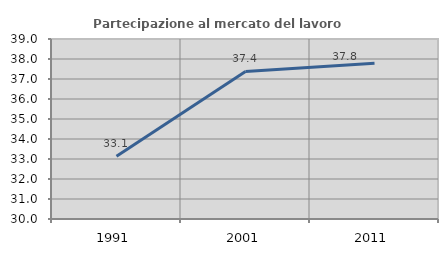
| Category | Partecipazione al mercato del lavoro  femminile |
|---|---|
| 1991.0 | 33.133 |
| 2001.0 | 37.381 |
| 2011.0 | 37.789 |